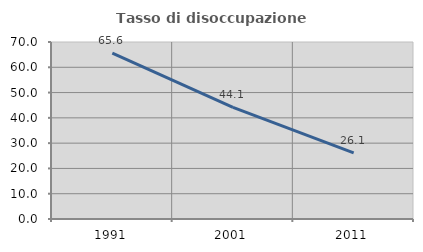
| Category | Tasso di disoccupazione giovanile  |
|---|---|
| 1991.0 | 65.591 |
| 2001.0 | 44.141 |
| 2011.0 | 26.131 |